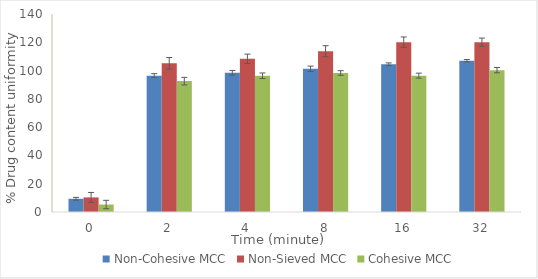
| Category | Non-Cohesive MCC | Non-Sieved MCC | Cohesive MCC |
|---|---|---|---|
| 0.0 | 9.36 | 10.33 | 5.28 |
| 2.0 | 96.38 | 105.14 | 92.54 |
| 4.0 | 98.44 | 108.3 | 96.33 |
| 8.0 | 101.26 | 113.69 | 98.27 |
| 16.0 | 104.44 | 120.1 | 96.41 |
| 32.0 | 107 | 120.1 | 100.3 |